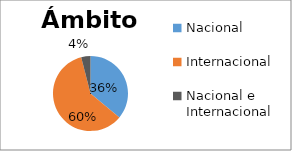
| Category | Ámbito |
|---|---|
| Nacional | 9 |
| Internacional | 15 |
| Nacional e Internacional | 1 |